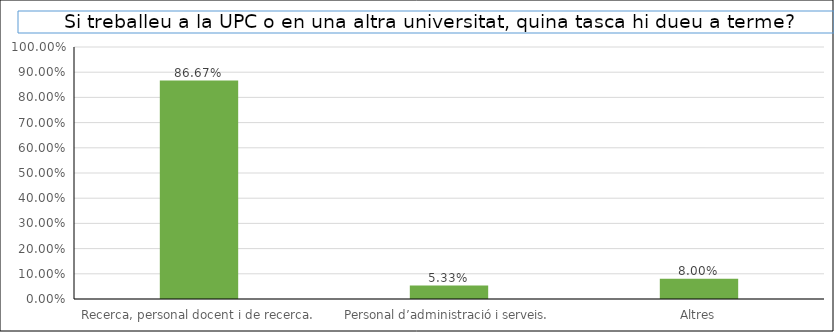
| Category | Series 0 |
|---|---|
| Recerca, personal docent i de recerca. | 0.867 |
| Personal d’administració i serveis. | 0.053 |
| Altres | 0.08 |